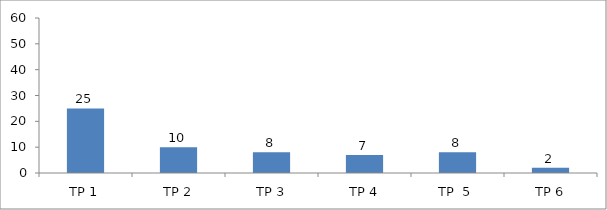
| Category | BIL. MURID |
|---|---|
| TP 1 | 25 |
| TP 2 | 10 |
|  TP 3 | 8 |
| TP 4 | 7 |
| TP  5 | 8 |
| TP 6 | 2 |